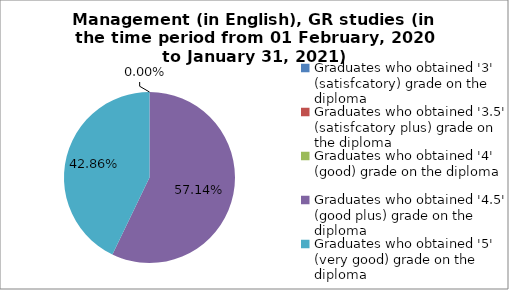
| Category | Series 0 |
|---|---|
| Graduates who obtained '3' (satisfcatory) grade on the diploma | 0 |
| Graduates who obtained '3.5' (satisfcatory plus) grade on the diploma | 0 |
| Graduates who obtained '4' (good) grade on the diploma | 0 |
| Graduates who obtained '4.5' (good plus) grade on the diploma | 57.143 |
| Graduates who obtained '5' (very good) grade on the diploma | 42.857 |